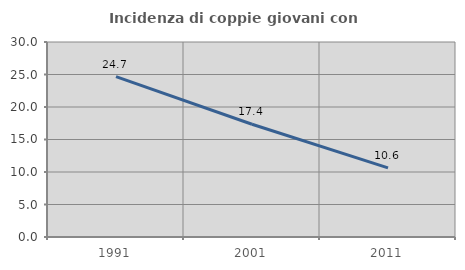
| Category | Incidenza di coppie giovani con figli |
|---|---|
| 1991.0 | 24.672 |
| 2001.0 | 17.352 |
| 2011.0 | 10.638 |